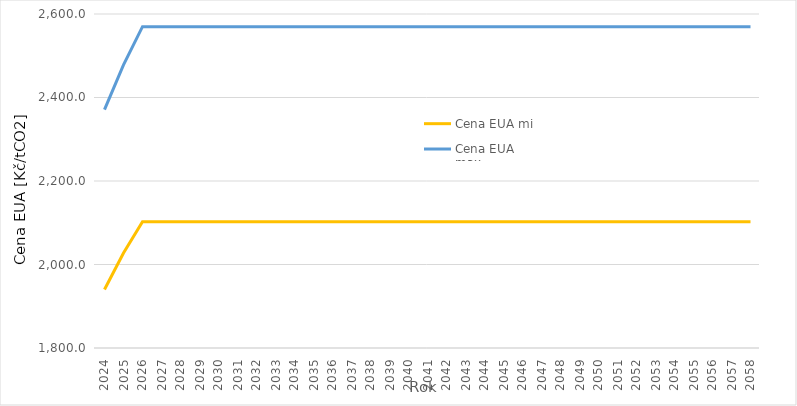
| Category | Cena EUA min. | Cena EUA max. |
|---|---|---|
| 2024.0 | 1940.04 | 2371.16 |
| 2025.0 | 2027.43 | 2477.97 |
| 2026.0 | 2102.4 | 2569.6 |
| 2027.0 | 2102.4 | 2569.6 |
| 2028.0 | 2102.4 | 2569.6 |
| 2029.0 | 2102.4 | 2569.6 |
| 2030.0 | 2102.4 | 2569.6 |
| 2031.0 | 2102.4 | 2569.6 |
| 2032.0 | 2102.4 | 2569.6 |
| 2033.0 | 2102.4 | 2569.6 |
| 2034.0 | 2102.4 | 2569.6 |
| 2035.0 | 2102.4 | 2569.6 |
| 2036.0 | 2102.4 | 2569.6 |
| 2037.0 | 2102.4 | 2569.6 |
| 2038.0 | 2102.4 | 2569.6 |
| 2039.0 | 2102.4 | 2569.6 |
| 2040.0 | 2102.4 | 2569.6 |
| 2041.0 | 2102.4 | 2569.6 |
| 2042.0 | 2102.4 | 2569.6 |
| 2043.0 | 2102.4 | 2569.6 |
| 2044.0 | 2102.4 | 2569.6 |
| 2045.0 | 2102.4 | 2569.6 |
| 2046.0 | 2102.4 | 2569.6 |
| 2047.0 | 2102.4 | 2569.6 |
| 2048.0 | 2102.4 | 2569.6 |
| 2049.0 | 2102.4 | 2569.6 |
| 2050.0 | 2102.4 | 2569.6 |
| 2051.0 | 2102.4 | 2569.6 |
| 2052.0 | 2102.4 | 2569.6 |
| 2053.0 | 2102.4 | 2569.6 |
| 2054.0 | 2102.4 | 2569.6 |
| 2055.0 | 2102.4 | 2569.6 |
| 2056.0 | 2102.4 | 2569.6 |
| 2057.0 | 2102.4 | 2569.6 |
| 2058.0 | 2102.4 | 2569.6 |